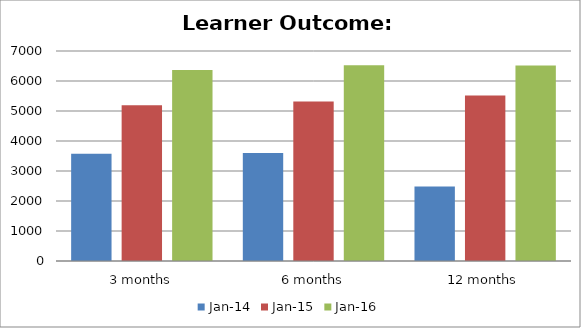
| Category | Jan-14 | Jan-15 | Jan-16 |
|---|---|---|---|
| 3 months | 3575 | 5190 | 6366 |
| 6 months | 3602 | 5318 | 6523 |
| 12 months | 2486 | 5519 | 6519 |